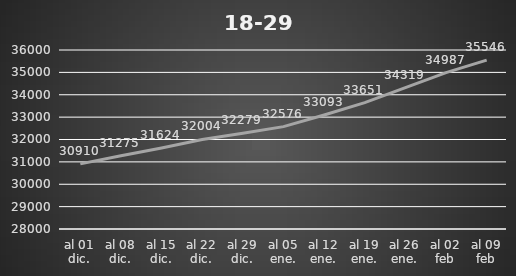
| Category | 18-29 |
|---|---|
| al 01 dic. | 30910 |
| al 08 dic. | 31275 |
| al 15 dic. | 31624 |
| al 22 dic. | 32004 |
| al 29 dic. | 32279 |
| al 05 ene. | 32576 |
| al 12 ene. | 33093 |
| al 19 ene. | 33651 |
| al 26 ene. | 34319 |
| al 02 feb | 34987 |
| al 09 feb | 35546 |